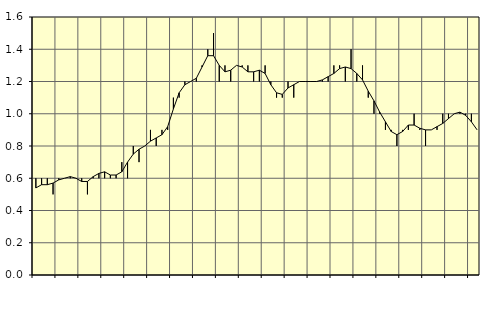
| Category | Piggar | Fast anställda utomlands |
|---|---|---|
| nan | 0.6 | 0.54 |
| 1.0 | 0.6 | 0.56 |
| 1.0 | 0.6 | 0.56 |
| 1.0 | 0.5 | 0.57 |
| nan | 0.6 | 0.59 |
| 2.0 | 0.6 | 0.6 |
| 2.0 | 0.6 | 0.61 |
| 2.0 | 0.6 | 0.6 |
| nan | 0.6 | 0.58 |
| 3.0 | 0.5 | 0.58 |
| 3.0 | 0.6 | 0.61 |
| 3.0 | 0.6 | 0.63 |
| nan | 0.6 | 0.64 |
| 4.0 | 0.6 | 0.62 |
| 4.0 | 0.6 | 0.62 |
| 4.0 | 0.7 | 0.64 |
| nan | 0.6 | 0.7 |
| 5.0 | 0.8 | 0.75 |
| 5.0 | 0.7 | 0.78 |
| 5.0 | 0.8 | 0.8 |
| nan | 0.9 | 0.83 |
| 6.0 | 0.8 | 0.85 |
| 6.0 | 0.9 | 0.87 |
| 6.0 | 0.9 | 0.92 |
| nan | 1.1 | 1.03 |
| 7.0 | 1.1 | 1.13 |
| 7.0 | 1.2 | 1.18 |
| 7.0 | 1.2 | 1.2 |
| nan | 1.2 | 1.22 |
| 8.0 | 1.3 | 1.29 |
| 8.0 | 1.4 | 1.36 |
| 8.0 | 1.5 | 1.36 |
| nan | 1.2 | 1.3 |
| 9.0 | 1.3 | 1.26 |
| 9.0 | 1.2 | 1.27 |
| 9.0 | 1.3 | 1.3 |
| nan | 1.3 | 1.29 |
| 10.0 | 1.3 | 1.26 |
| 10.0 | 1.2 | 1.26 |
| 10.0 | 1.2 | 1.27 |
| nan | 1.3 | 1.25 |
| 11.0 | 1.2 | 1.18 |
| 11.0 | 1.1 | 1.13 |
| 11.0 | 1.1 | 1.12 |
| nan | 1.2 | 1.16 |
| 12.0 | 1.1 | 1.18 |
| 12.0 | 1.2 | 1.2 |
| 12.0 | 1.2 | 1.2 |
| nan | 1.2 | 1.2 |
| 13.0 | 1.2 | 1.2 |
| 13.0 | 1.2 | 1.21 |
| 13.0 | 1.2 | 1.23 |
| nan | 1.3 | 1.25 |
| 14.0 | 1.3 | 1.28 |
| 14.0 | 1.2 | 1.29 |
| 14.0 | 1.4 | 1.28 |
| nan | 1.2 | 1.25 |
| 15.0 | 1.3 | 1.21 |
| 15.0 | 1.1 | 1.14 |
| 15.0 | 1 | 1.08 |
| nan | 1 | 1.01 |
| 16.0 | 0.9 | 0.95 |
| 16.0 | 0.9 | 0.89 |
| 16.0 | 0.8 | 0.87 |
| nan | 0.9 | 0.89 |
| 17.0 | 0.9 | 0.93 |
| 17.0 | 1 | 0.93 |
| 17.0 | 0.9 | 0.91 |
| nan | 0.8 | 0.9 |
| 18.0 | 0.9 | 0.9 |
| 18.0 | 0.9 | 0.92 |
| 18.0 | 1 | 0.94 |
| nan | 1 | 0.97 |
| 19.0 | 1 | 1 |
| 19.0 | 1 | 1.01 |
| 19.0 | 1 | 0.99 |
| nan | 1 | 0.95 |
| 20.0 | 0.9 | 0.9 |